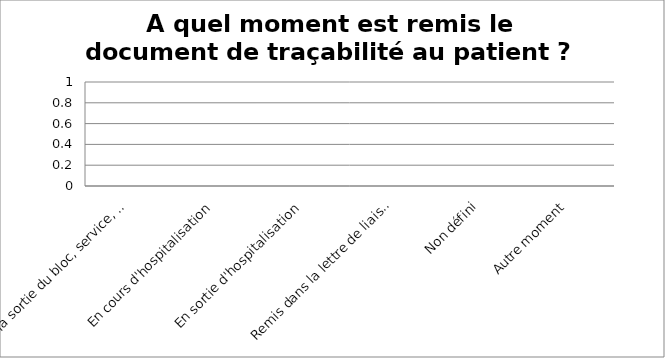
| Category | A quel moment est remis le document de traçabilité au patient ? |
|---|---|
| A la sortie du bloc, service, plateau technique…où a été réalisée la pose | 0 |
| En cours d'hospitalisation | 0 |
| En sortie d'hospitalisation | 0 |
| Remis dans la lettre de liaison | 0 |
| Non défini | 0 |
| Autre moment | 0 |